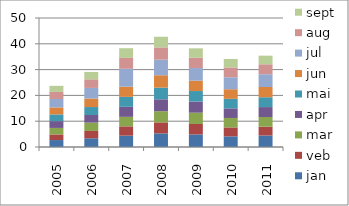
| Category | jan | veb | mar | apr | mai | jun | jul | aug | sept |
|---|---|---|---|---|---|---|---|---|---|
| 2005.0 | 2.696 | 2.174 | 2.519 | 2.625 | 2.626 | 2.702 | 3.265 | 2.737 | 2.357 |
| 2006.0 | 3.394 | 2.822 | 3.232 | 2.958 | 3.081 | 3.304 | 4.102 | 3.335 | 2.861 |
| 2007.0 | 4.397 | 3.603 | 3.687 | 3.882 | 3.862 | 3.951 | 6.935 | 4.215 | 3.759 |
| 2008.0 | 5.263 | 4.278 | 4.319 | 4.624 | 4.525 | 4.796 | 6.04 | 4.762 | 4.118 |
| 2009.0 | 4.869 | 4.048 | 4.373 | 4.32 | 4.081 | 4.015 | 4.891 | 4 | 3.638 |
| 2010.0 | 4.121 | 3.47 | 3.663 | 3.721 | 3.696 | 3.72 | 4.635 | 3.803 | 3.292 |
| 2011.0 | 4.455 | 3.405 | 3.764 | 3.854 | 3.805 | 3.981 | 4.942 | 3.86 | 3.332 |